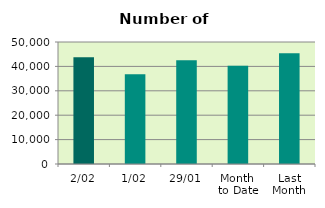
| Category | Series 0 |
|---|---|
| 2/02 | 43720 |
| 1/02 | 36830 |
| 29/01 | 42500 |
| Month 
to Date | 40275 |
| Last
Month | 45378.8 |